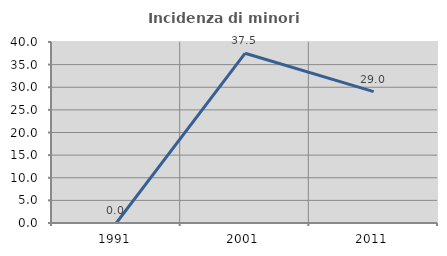
| Category | Incidenza di minori stranieri |
|---|---|
| 1991.0 | 0 |
| 2001.0 | 37.5 |
| 2011.0 | 29.032 |